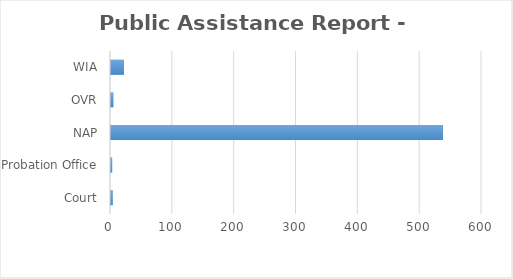
| Category | Series 0 |
|---|---|
| Court | 3 |
| Probation Office | 2 |
| NAP | 537 |
| OVR | 4 |
| WIA | 21 |